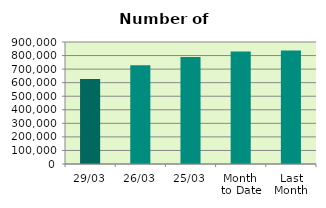
| Category | Series 0 |
|---|---|
| 29/03 | 627092 |
| 26/03 | 728914 |
| 25/03 | 789780 |
| Month 
to Date | 829512.286 |
| Last
Month | 836497.7 |